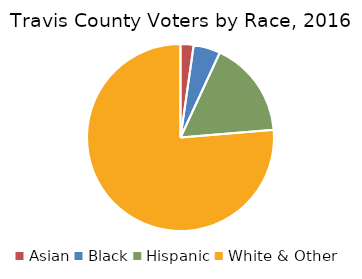
| Category | Voted |
|---|---|
| Asian | 10734 |
| Black | 21963 |
| Hispanic | 79520 |
| White & Other | 361786 |